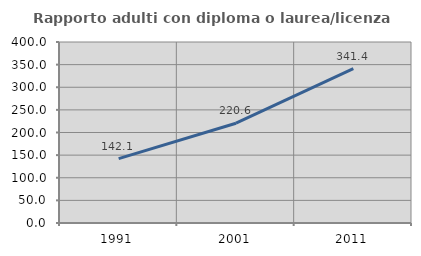
| Category | Rapporto adulti con diploma o laurea/licenza media  |
|---|---|
| 1991.0 | 142.124 |
| 2001.0 | 220.574 |
| 2011.0 | 341.392 |